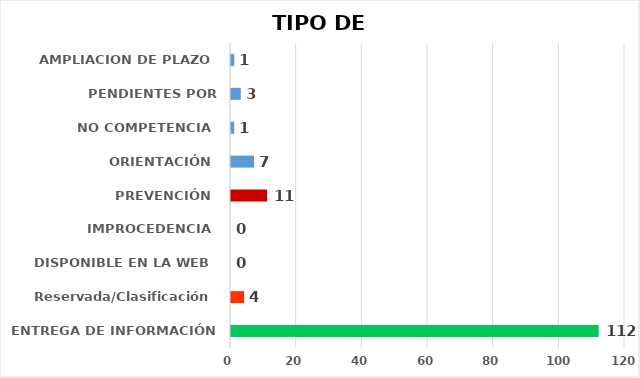
| Category | CANTIDAD DE RESPUESTAS |
|---|---|
| ENTREGA DE INFORMACIÓN | 112 |
| Reservada/Clasificación | 4 |
| DISPONIBLE EN LA WEB | 0 |
| IMPROCEDENCIA | 0 |
| PREVENCIÓN | 11 |
| ORIENTACIÓN | 7 |
| NO COMPETENCIA | 1 |
| PENDIENTES POR CONTESTAR | 3 |
| AMPLIACION DE PLAZO | 1 |